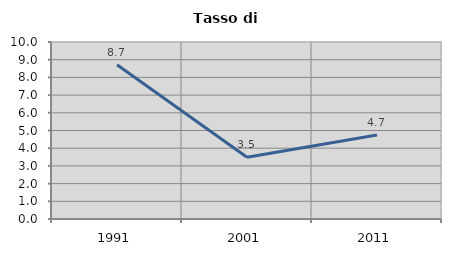
| Category | Tasso di disoccupazione   |
|---|---|
| 1991.0 | 8.716 |
| 2001.0 | 3.486 |
| 2011.0 | 4.741 |